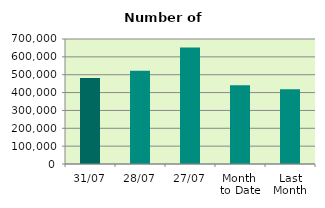
| Category | Series 0 |
|---|---|
| 31/07 | 482186 |
| 28/07 | 521936 |
| 27/07 | 652344 |
| Month 
to Date | 440756.667 |
| Last
Month | 418146.182 |